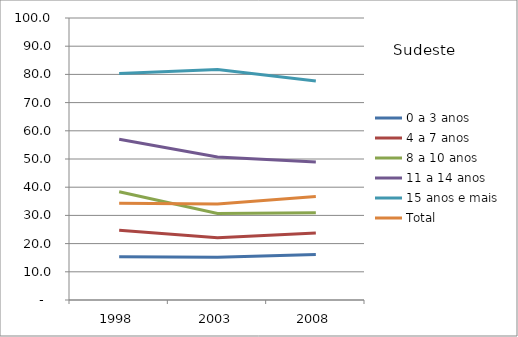
| Category | 0 a 3 anos | 4 a 7 anos | 8 a 10 anos | 11 a 14 anos | 15 anos e mais | Total |
|---|---|---|---|---|---|---|
| 1998.0 | 15.3 | 24.7 | 38.4 | 57 | 80.3 | 34.3 |
| 2003.0 | 15.2 | 22.1 | 30.7 | 50.7 | 81.7 | 34 |
| 2008.0 | 16.1 | 23.8 | 30.9 | 48.9 | 77.7 | 36.7 |